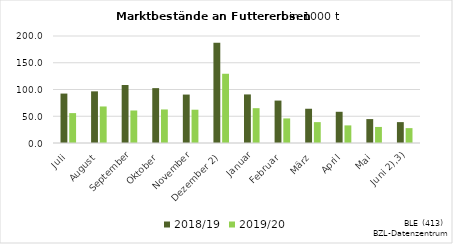
| Category | 2018/19 | 2019/20 |
|---|---|---|
| Juli | 92.402 | 55.883 |
| August | 96.557 | 68.289 |
| September | 108.366 | 60.772 |
| Oktober | 102.565 | 62.687 |
| November | 90.527 | 62.228 |
|  Dezember 2) | 187.383 | 129.423 |
| Januar | 90.791 | 65.097 |
| Februar | 79.297 | 45.944 |
| März | 64.016 | 39.019 |
| April | 58.349 | 32.898 |
| Mai | 44.712 | 30.009 |
|    Juni 2),3) | 39.036 | 27.802 |